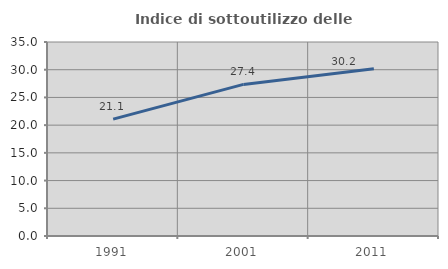
| Category | Indice di sottoutilizzo delle abitazioni  |
|---|---|
| 1991.0 | 21.094 |
| 2001.0 | 27.35 |
| 2011.0 | 30.189 |